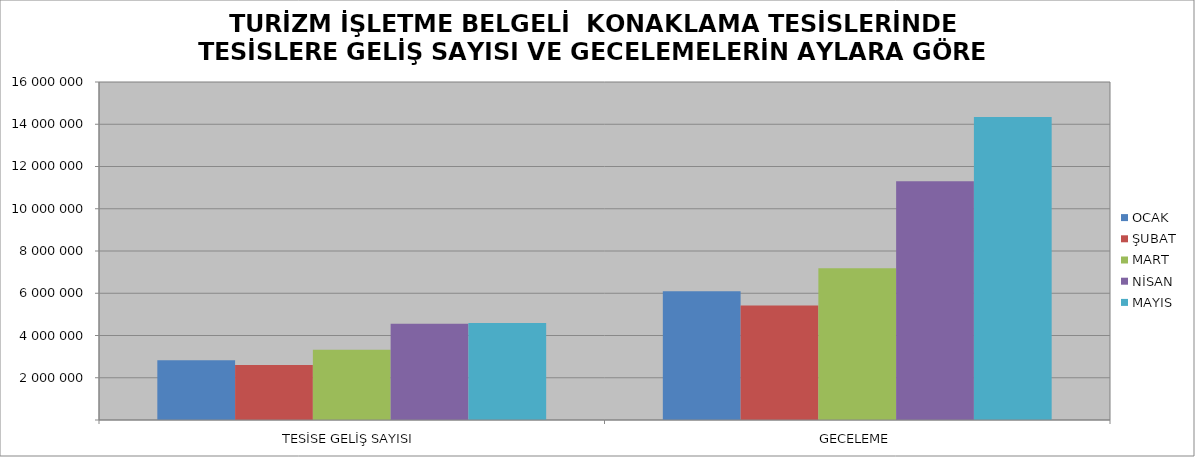
| Category | OCAK | ŞUBAT | MART | NİSAN | MAYIS |
|---|---|---|---|---|---|
| TESİSE GELİŞ SAYISI | 2833509 | 2607189 | 3326719 | 4561709 | 4585981 |
| GECELEME | 6098050 | 5425989 | 7182593 | 11302946 | 14338328 |